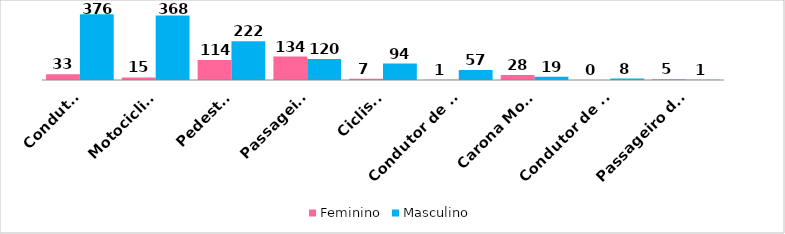
| Category | Feminino | Masculino |
|---|---|---|
| Condutor | 33 | 376 |
| Motociclista | 15 | 368 |
| Pedestre | 114 | 222 |
| Passageiro | 134 | 120 |
| Ciclista | 7 | 94 |
| Condutor de Caminhão | 1 | 57 |
| Carona Moto | 28 | 19 |
| Condutor de Trator | 0 | 8 |
| Passageiro de Ônibus | 5 | 1 |